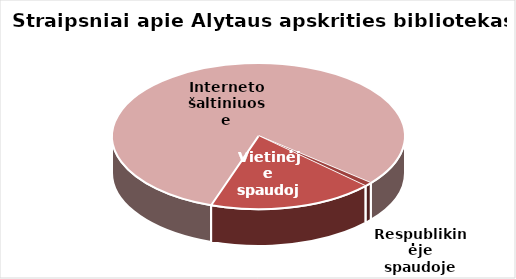
| Category | Series 0 |
|---|---|
| Respublikinėje spaudoje | 12 |
| Vietinėje spaudoje | 250 |
| Interneto šaltiniuose | 1108 |